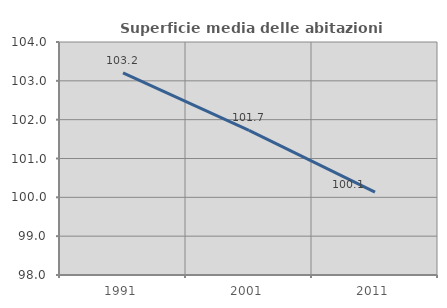
| Category | Superficie media delle abitazioni occupate |
|---|---|
| 1991.0 | 103.204 |
| 2001.0 | 101.727 |
| 2011.0 | 100.135 |